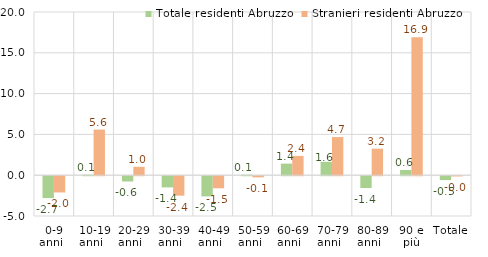
| Category | Totale residenti | Stranieri residenti |
|---|---|---|
| 0-9 anni   | -2.68 | -1.993 |
| 10-19 anni   | 0.066 | 5.59 |
| 20-29 anni   | -0.646 | 1.029 |
| 30-39 anni   | -1.372 | -2.383 |
| 40-49 anni   | -2.474 | -1.479 |
| 50-59 anni   | 0.058 | -0.141 |
| 60-69 anni   | 1.416 | 2.371 |
| 70-79 anni   | 1.634 | 4.674 |
| 80-89 anni   | -1.445 | 3.248 |
| 90 e più | 0.634 | 16.901 |
| Totale   | -0.477 | -0.031 |